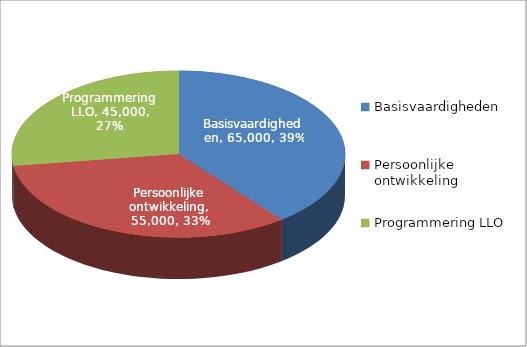
| Category | Series 0 |
|---|---|
| Basisvaardigheden | 65000 |
| Persoonlijke ontwikkeling | 55000 |
| Programmering LLO | 45000 |